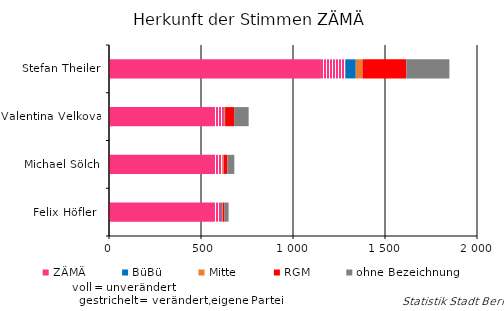
| Category | ZÄMÄ | verändert, eigene Liste | BüBü | Mitte | RGM | ohne Bezeichnung |
|---|---|---|---|---|---|---|
| Stefan Theiler | 1152 | 133 | 56 | 37 | 238 | 234 |
| Valentina Velkova | 576 | 48 | 4 | 3 | 49 | 79 |
| Michael Sölch | 576 | 41 | 1 | 5 | 20 | 38 |
| Felix Höfler  | 576 | 34 | 4 | 5 | 9 | 22 |